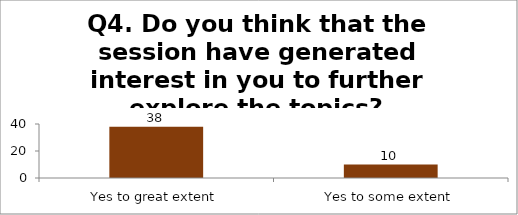
| Category | Q4. Do you think that the session have generated interest in you to further explore the topics? |
|---|---|
| Yes to great extent | 38 |
| Yes to some extent | 10 |